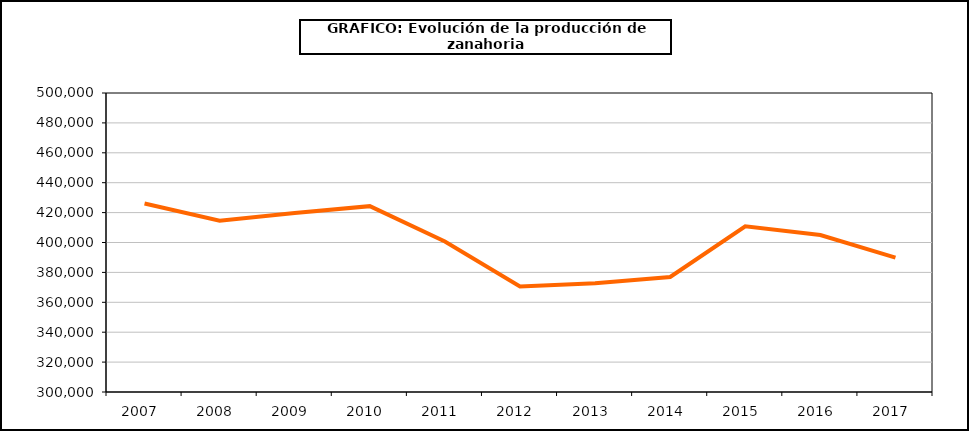
| Category | producción |
|---|---|
| 2007.0 | 426074 |
| 2008.0 | 414507 |
| 2009.0 | 419662 |
| 2010.0 | 424311 |
| 2011.0 | 400628 |
| 2012.0 | 370570 |
| 2013.0 | 372714 |
| 2014.0 | 376952 |
| 2015.0 | 410865 |
| 2016.0 | 404962 |
| 2017.0 | 389844 |